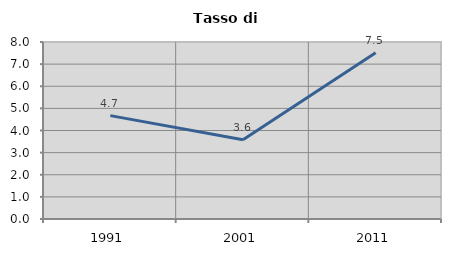
| Category | Tasso di disoccupazione   |
|---|---|
| 1991.0 | 4.673 |
| 2001.0 | 3.579 |
| 2011.0 | 7.511 |